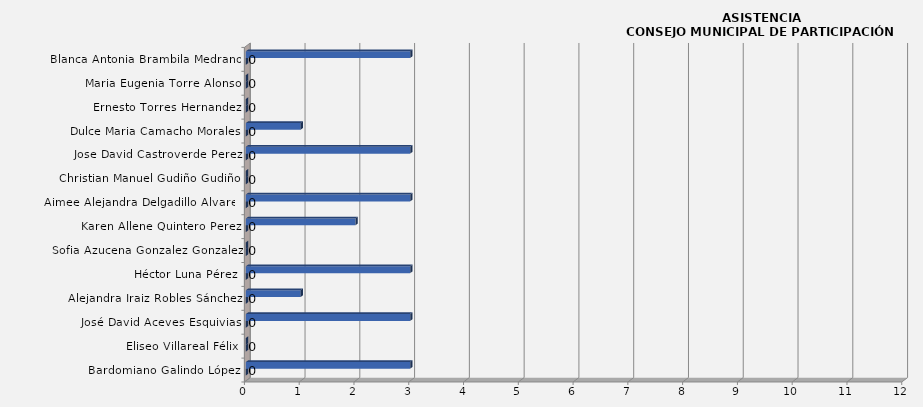
| Category | NOMBRE+'Registro de Asistencia'!$A$5 | Total de asistencias |
|---|---|---|
| Bardomiano Galindo López | 0 | 3 |
| Eliseo Villareal Félix | 0 | 0 |
| José David Aceves Esquivias | 0 | 3 |
| Alejandra Iraiz Robles Sánchez | 0 | 1 |
| Héctor Luna Pérez | 0 | 3 |
| Sofia Azucena Gonzalez Gonzalez | 0 | 0 |
| Karen Allene Quintero Perez | 0 | 2 |
| Aimee Alejandra Delgadillo Alvarez | 0 | 3 |
| Christian Manuel Gudiño Gudiño | 0 | 0 |
| Jose David Castroverde Perez | 0 | 3 |
| Dulce Maria Camacho Morales | 0 | 1 |
| Ernesto Torres Hernandez | 0 | 0 |
| Maria Eugenia Torre Alonso | 0 | 0 |
| Blanca Antonia Brambila Medrano | 0 | 3 |